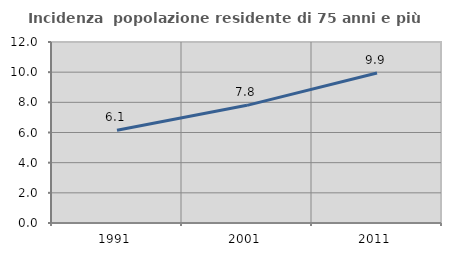
| Category | Incidenza  popolazione residente di 75 anni e più |
|---|---|
| 1991.0 | 6.149 |
| 2001.0 | 7.8 |
| 2011.0 | 9.946 |